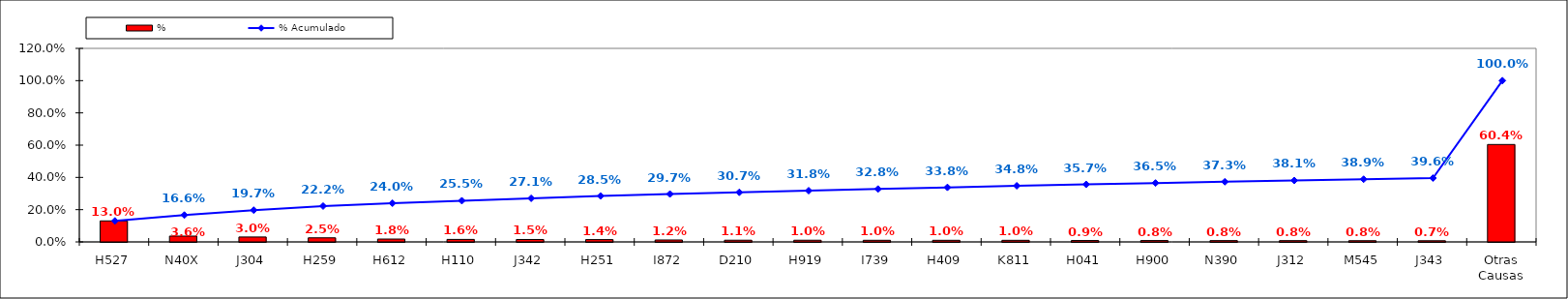
| Category | % |
|---|---|
| H527 | 0.13 |
| N40X | 0.036 |
| J304 | 0.03 |
| H259 | 0.025 |
| H612 | 0.018 |
| H110 | 0.016 |
| J342 | 0.015 |
| H251 | 0.014 |
| I872 | 0.012 |
| D210 | 0.011 |
| H919 | 0.01 |
| I739 | 0.01 |
| H409 | 0.01 |
| K811 | 0.01 |
| H041 | 0.009 |
| H900 | 0.008 |
| N390 | 0.008 |
| J312 | 0.008 |
| M545 | 0.008 |
| J343 | 0.007 |
| Otras Causas | 0.604 |